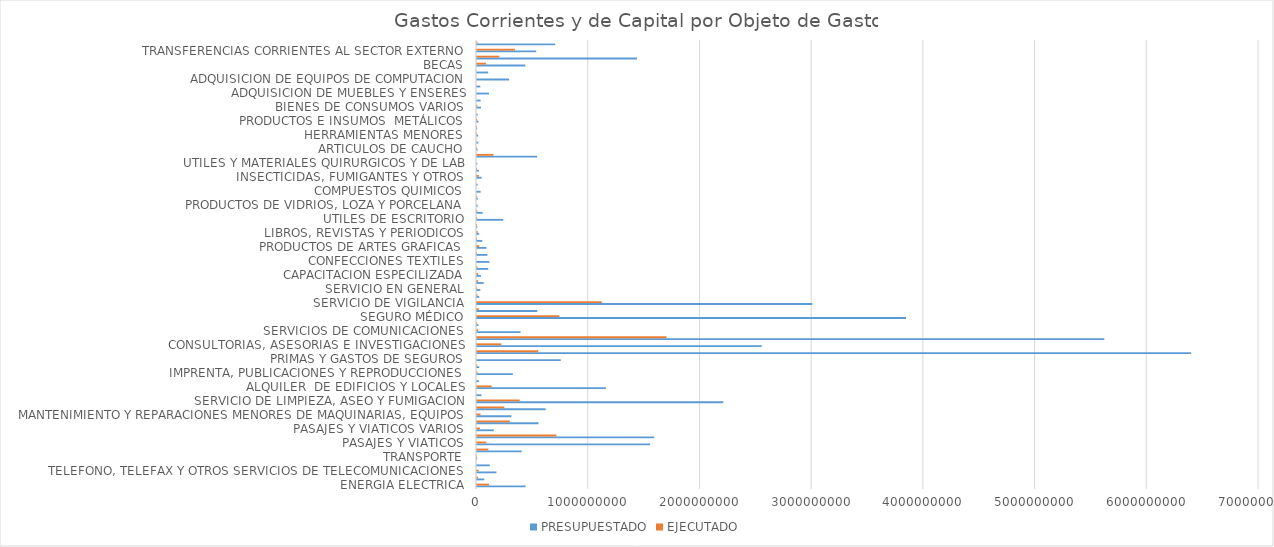
| Category | PRESUPUESTADO | EJECUTADO |
|---|---|---|
| ENERGIA ELECTRICA | 435000000 | 107534018 |
| AGUA | 64950000 | 9513598 |
| TELEFONO, TELEFAX Y OTROS SERVICIOS DE TELECOMUNICACIONES | 174050000 | 14169026 |
| CORREOS Y OTROS SERVICIOS POSTALES | 114500000 | 0 |
| TRANSPORTE | 2000000 | 80000 |
| TRANSPORTE DE PERSONAS | 400000000 | 101091500 |
| PASAJES Y VIATICOS | 1550000000 | 82796993 |
| VIATICOS Y MOVILIDAD | 1586633884 | 710390206 |
| PASAJES Y VIATICOS VARIOS | 150000000 | 26327249 |
| MANTENIMIENTO Y REPARACIONES MENORES DE EDIFICIOS Y LOCALES | 550000000 | 293947108 |
| MANTENIMIENTO Y REPARACIONES MENORES DE MAQUINARIAS, EQUIPOS | 308000000 | 31273154 |
| MANTEMIENTOS Y REPARACIONES MENORES DE EQUIPOS DE TRANSPORTE | 614600000 | 244099703 |
| SERVICIO DE LIMPIEZA, ASEO Y FUMIGACION | 2204000000 | 382248235 |
| MANTENIMIENTO Y REPACIONES MENORES DE INSTALACIONES | 40000000 | 0 |
| ALQUILER  DE EDIFICIOS Y LOCALES | 1153000000 | 131433839 |
| DE INFORMATICA Y SISTEMAS COMPUTARIZADOS | 17000000 | 0 |
| IMPRENTA, PUBLICACIONES Y REPRODUCCIONES | 321217400 | 3658700 |
| SERVICIOS BANCARIOS | 20000000 | 1690445 |
| PRIMAS Y GASTOS DE SEGUROS | 750000000 | 0 |
| PUBLICIDAD Y PROPAGANDA | 6392277953 | 548076277 |
| CONSULTORIAS, ASESORIAS E INVESTIGACIONES | 2547482320 | 217539166 |
| PROMOCIONES Y EXPOSICIONES | 5615000000 | 1696173332 |
| SERVICIOS DE COMUNICACIONES | 390000000 | 9491978 |
| SERVICIOS TECNICOS Y PROFESIONALES | 13500000 | 500000 |
| SEGURO MÉDICO | 3840000000 | 737295000 |
| SERVICIO DE CEREMONIAL | 540000000 | 15375000 |
| SERVICIO DE VIGILANCIA | 3001206250 | 1116900000 |
| SERVICIO DE CATERING | 20000000 | 4544100 |
| SERVICIO EN GENERAL | 30000000 | 1039500 |
| CAPACITACION DEL PERSONAL  DEL ESTADO | 60000000 | 10000000 |
| CAPACITACION ESPECILIZADA | 35000000 | 10350000 |
| ALIMENTOS PARA LAS PERSONAS | 100210000 | 3866365 |
| CONFECCIONES TEXTILES | 111275000 | 0 |
| PAPEL DE ESCRITORIO Y CARTON | 93000000 | 251000 |
| PRODUCTOS DE ARTES GRAFICAS | 85000000 | 18862600 |
| PRODUCTOS DE PAPEL Y CARTON | 47000000 | 203500 |
| LIBROS, REVISTAS Y PERIODICOS | 20000000 | 5577375 |
| ELEMENTOS DE LIMPIEZA | 2610000 | 88300 |
| UTILES DE ESCRITORIO | 235000000 | 410000 |
| UTILES Y MATERIALES ELECTRICOS | 51554800 | 1883300 |
| PRODUCTOS DE VIDRIOS, LOZA Y PORCELANA | 5850000 | 0 |
| REPUESTOS Y ACCESORIOS MENORES | 7000000 | 660000 |
| COMPUESTOS QUIMICOS | 32383000 | 0 |
| PRODUCTOS FARMACEUTICOS | 5000000 | 0 |
| INSECTICIDAS, FUMIGANTES Y OTROS | 41250000 | 16231850 |
| TINTAS, PINTURAS Y COLORANTES | 16600000 | 8000 |
| UTILES Y MATERIALES QUIRURGICOS Y DE LAB | 2400000 | 0 |
| COMBUSTIBLES  | 537784000 | 147595349 |
| ARTICULOS DE CAUCHO | 5550000 | 73000 |
| CUBIERTAS Y CÁMARAS DE AIRE | 12000000 | 0 |
| HERRAMIENTAS MENORES | 10440000 | 686000 |
| ARTICULOS DE PLASTICOS | 1710000 | 242700 |
| PRODUCTOS E INSUMOS  METÁLICOS | 13570000 | 926200 |
| PRODUCTOS E INSUMOS NO METÁLICOS | 6500000 | 0 |
| BIENES DE CONSUMOS VARIOS | 35540000 | 2063300 |
| HERRAMIENTAS, APARATOS E INSTRUMENTOS EN GRAL  | 32800000 | 0 |
| ADQUISICION DE MUEBLES Y ENSERES | 108000000 | 0 |
| ADQUISICION DE EQUIPOS DE OFICINA Y COMPUTACIÓN | 30000000 | 0 |
| ADQUISICION DE EQUIPOS DE COMPUTACION | 287500000 | 0 |
| ACTIVOS INTAGIBLES | 100000000 | 0 |
| BECAS | 432000000 | 79920000 |
| APORTE A ENTIDADES EDUCATIVAS E INST. SIN FINES DE LUCRO | 1432766742 | 200000000 |
| TRANSFERENCIAS CORRIENTES AL SECTOR EXTERNO | 530000000 | 340000000 |
| PAGO DE IMPUESTOS, TASA, GASTOS JUDICIALES Y OTROS | 699860316 | 4227952 |